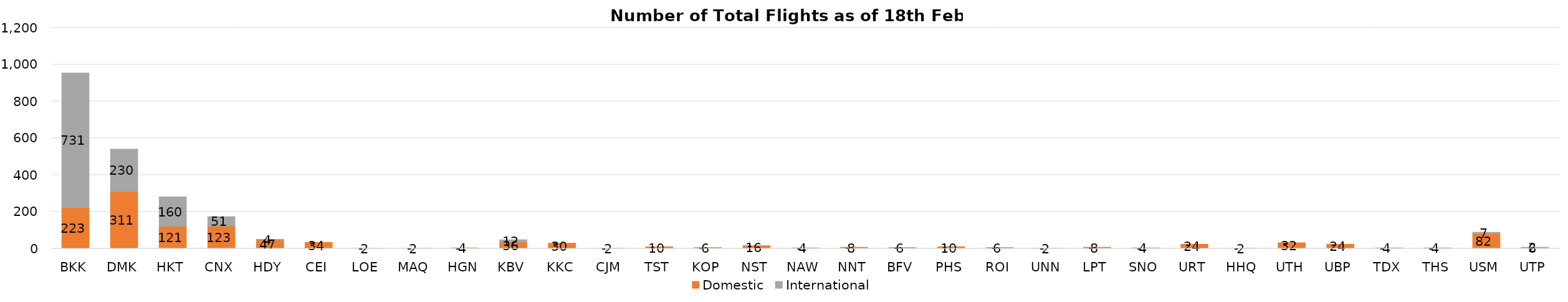
| Category | Domestic | International |
|---|---|---|
| BKK | 223 | 731 |
| DMK | 311 | 230 |
| HKT | 121 | 160 |
| CNX | 123 | 51 |
| HDY | 47 | 4 |
| CEI | 34 | 0 |
| LOE | 2 | 0 |
| MAQ | 2 | 0 |
| HGN | 4 | 0 |
| KBV | 36 | 12 |
| KKC | 30 | 0 |
| CJM | 2 | 0 |
| TST | 10 | 0 |
| KOP | 6 | 0 |
| NST | 16 | 0 |
| NAW | 4 | 0 |
| NNT | 8 | 0 |
| BFV | 6 | 0 |
| PHS | 10 | 0 |
| ROI | 6 | 0 |
| UNN | 2 | 0 |
| LPT | 8 | 0 |
| SNO | 4 | 0 |
| URT | 24 | 0 |
| HHQ | 2 | 0 |
| UTH | 32 | 0 |
| UBP | 24 | 0 |
| TDX | 4 | 0 |
| THS | 4 | 0 |
| USM | 82 | 7 |
| UTP | 6 | 2 |